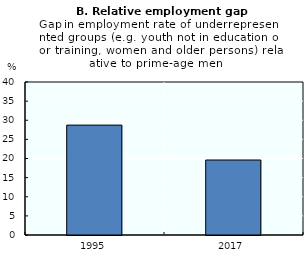
| Category | Series 0 |
|---|---|
| 1995.0 | 28.729 |
| 2017.0 | 19.606 |